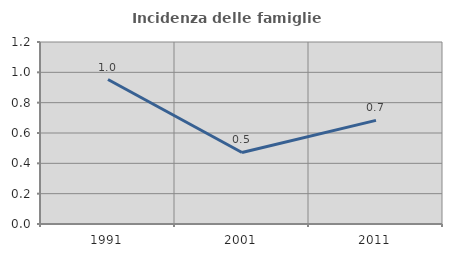
| Category | Incidenza delle famiglie numerose |
|---|---|
| 1991.0 | 0.952 |
| 2001.0 | 0.472 |
| 2011.0 | 0.683 |